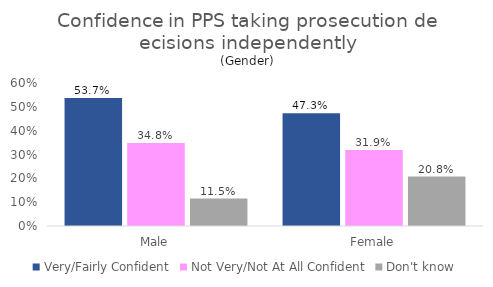
| Category | Very/Fairly Confident | Not Very/Not At All Confident | Don't know |
|---|---|---|---|
| Male | 0.537 | 0.348 | 0.115 |
| Female | 0.473 | 0.319 | 0.208 |